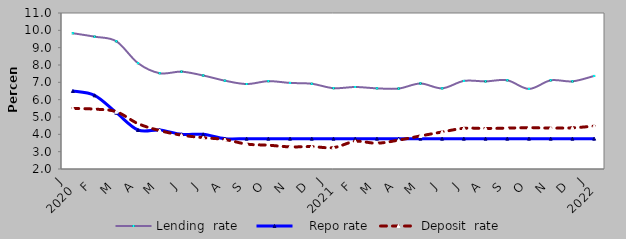
| Category | Lending  rate |    Repo rate | Deposit  rate |
|---|---|---|---|
| 0 | 9.833 | 6.5 | 5.497 |
| 1900-01-01 | 9.634 | 6.25 | 5.454 |
| 1900-01-02 | 9.369 | 5.25 | 5.304 |
| 1900-01-03 | 8.106 | 4.25 | 4.617 |
| 1900-01-04 | 7.526 | 4.25 | 4.216 |
| 1900-01-05 | 7.616 | 4 | 3.953 |
| 1900-01-06 | 7.394 | 4 | 3.809 |
| 1900-01-07 | 7.095 | 3.75 | 3.699 |
| 1900-01-08 | 6.902 | 3.75 | 3.437 |
| 1900-01-09 | 7.067 | 3.75 | 3.374 |
| 1900-01-10 | 6.965 | 3.75 | 3.276 |
| 1900-01-11 | 6.917 | 3.75 | 3.292 |
| 1900-01-12 | 6.663 | 3.75 | 3.236 |
| 1900-01-13 | 6.731 | 3.75 | 3.592 |
| 1900-01-14 | 6.653 | 3.75 | 3.488 |
| 1900-01-15 | 6.64 | 3.75 | 3.667 |
| 1900-01-16 | 6.933 | 3.75 | 3.907 |
| 1900-01-17 | 6.654 | 3.75 | 4.137 |
| 1900-01-18 | 7.081 | 3.75 | 4.347 |
| 1900-01-19 | 7.055 | 3.75 | 4.341 |
| 1900-01-20 | 7.118 | 3.75 | 4.357 |
| 1900-01-21 | 6.62 | 3.75 | 4.386 |
| 1900-01-22 | 7.116 | 3.75 | 4.36 |
| 1900-01-23 | 7.056 | 3.75 | 4.377 |
| 1900-01-24 | 7.368 | 3.75 | 4.473 |